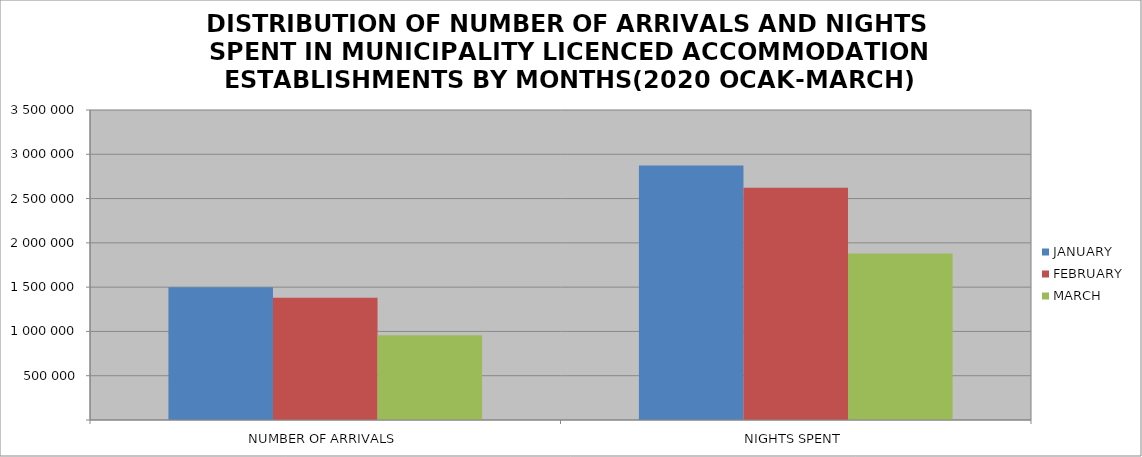
| Category | JANUARY | FEBRUARY | MARCH |
|---|---|---|---|
| NUMBER OF ARRIVALS | 1497815 | 1380765 | 955554 |
| NIGHTS SPENT | 2872303 | 2621819 | 1878971 |